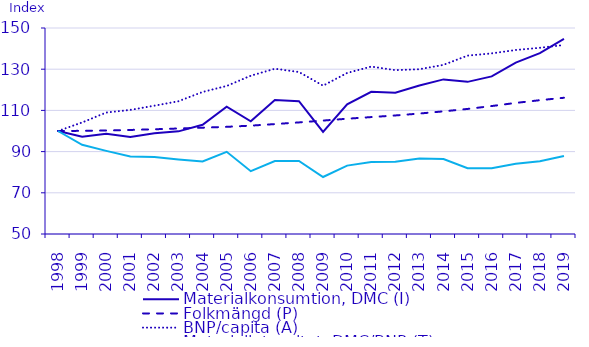
| Category | Materialkonsumtion, DMC (I) | Folkmängd (P) | BNP/capita (A) | Materialintensitet, DMC/BNP (T) |
|---|---|---|---|---|
| 1998.0 | 100 | 100 | 100 | 100 |
| 1999.0 | 97.241 | 100.079 | 104.165 | 93.279 |
| 2000.0 | 98.687 | 100.237 | 108.957 | 90.36 |
| 2001.0 | 97.091 | 100.508 | 110.239 | 87.628 |
| 2002.0 | 98.892 | 100.836 | 112.294 | 87.335 |
| 2003.0 | 99.823 | 101.22 | 114.452 | 86.167 |
| 2004.0 | 103.025 | 101.616 | 118.951 | 85.234 |
| 2005.0 | 111.765 | 102.022 | 121.864 | 89.895 |
| 2006.0 | 104.734 | 102.599 | 126.83 | 80.487 |
| 2007.0 | 114.994 | 103.356 | 130.231 | 85.433 |
| 2008.0 | 114.471 | 104.169 | 128.632 | 85.43 |
| 2009.0 | 99.544 | 105.062 | 122.004 | 77.66 |
| 2010.0 | 112.991 | 105.954 | 128.177 | 83.199 |
| 2011.0 | 119.002 | 106.756 | 131.279 | 84.911 |
| 2012.0 | 118.591 | 107.547 | 129.547 | 85.119 |
| 2013.0 | 122.089 | 108.462 | 129.979 | 86.601 |
| 2014.0 | 125.049 | 109.547 | 132.113 | 86.404 |
| 2015.0 | 123.857 | 110.711 | 136.593 | 81.904 |
| 2016.0 | 126.506 | 112.112 | 137.679 | 81.958 |
| 2017.0 | 133.201 | 113.637 | 139.319 | 84.135 |
| 2018.0 | 137.784 | 114.959 | 140.402 | 85.366 |
| 2019.0 | 144.686 | 116.134 | 141.742 | 87.896 |